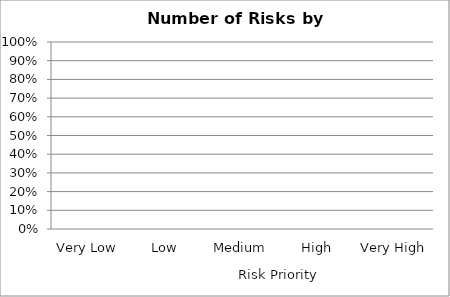
| Category |  Number of Risks by Priority |
|---|---|
| 0 | 0 |
| 1 | 0 |
| 2 | 0 |
| 3 | 0 |
| 4 | 0 |